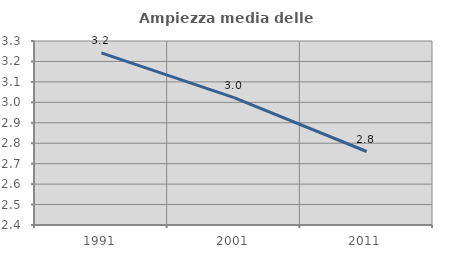
| Category | Ampiezza media delle famiglie |
|---|---|
| 1991.0 | 3.242 |
| 2001.0 | 3.023 |
| 2011.0 | 2.759 |